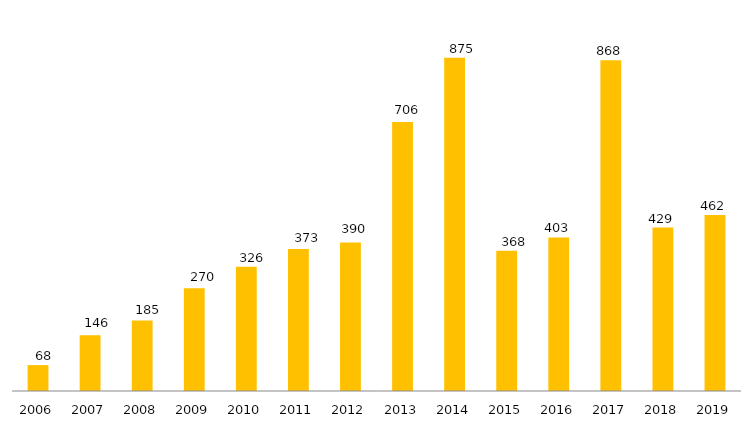
| Category | Pós - Graduação UFGD |
|---|---|
| 2006.0 | 68 |
| 2007.0 | 146 |
| 2008.0 | 185 |
| 2009.0 | 270 |
| 2010.0 | 326 |
| 2011.0 | 373 |
| 2012.0 | 390 |
| 2013.0 | 706 |
| 2014.0 | 875 |
| 2015.0 | 368 |
| 2016.0 | 403 |
| 2017.0 | 868 |
| 2018.0 | 429 |
| 2019.0 | 462 |